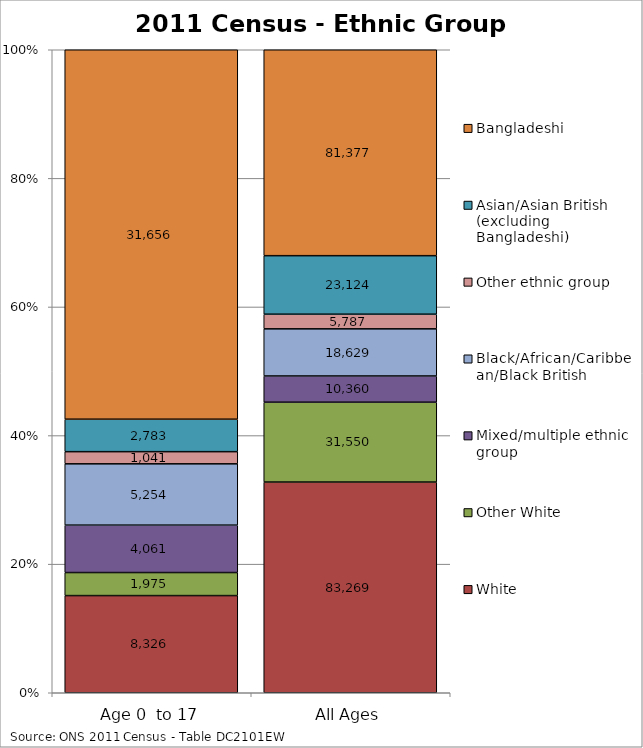
| Category | White | Other White | Mixed/multiple ethnic group | Black/African/Caribbean/Black British | Other ethnic group | Asian/Asian British (excluding Bangladeshi) | Bangladeshi |
|---|---|---|---|---|---|---|---|
| Age 0  to 17 | 8326 | 1975 | 4061 | 5254 | 1041 | 2783 | 31656 |
| All Ages | 83269 | 31550 | 10360 | 18629 | 5787 | 23124 | 81377 |